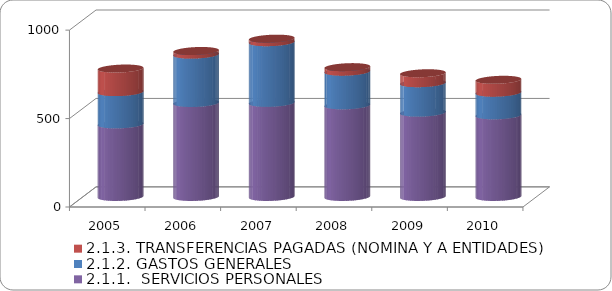
| Category | 2.1.1.  SERVICIOS PERSONALES | 2.1.2. GASTOS GENERALES | 2.1.3. TRANSFERENCIAS PAGADAS (NOMINA Y A ENTIDADES) |
|---|---|---|---|
| 2005 | 410.492 | 182.362 | 133.007 |
| 2006 | 531.517 | 273.468 | 20.159 |
| 2007 | 532.271 | 342.85 | 19.775 |
| 2008 | 518.291 | 190.123 | 25.4 |
| 2009 | 476.896 | 166.391 | 55.986 |
| 2010 | 461.801 | 127.864 | 72.558 |